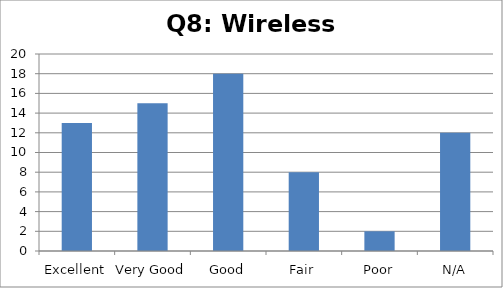
| Category | Response count |
|---|---|
| Excellent | 13 |
| Very Good | 15 |
| Good | 18 |
| Fair | 8 |
| Poor | 2 |
| N/A | 12 |